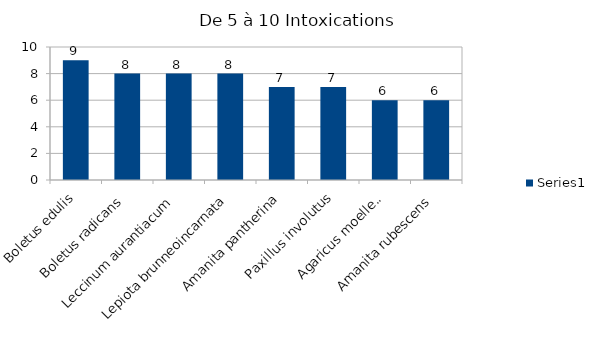
| Category | Series 0 |
|---|---|
| Boletus edulis | 9 |
| Boletus radicans | 8 |
| Leccinum aurantiacum | 8 |
| Lepiota brunneoincarnata | 8 |
| Amanita pantherina | 7 |
| Paxillus involutus | 7 |
| Agaricus moelleri | 6 |
| Amanita rubescens | 6 |